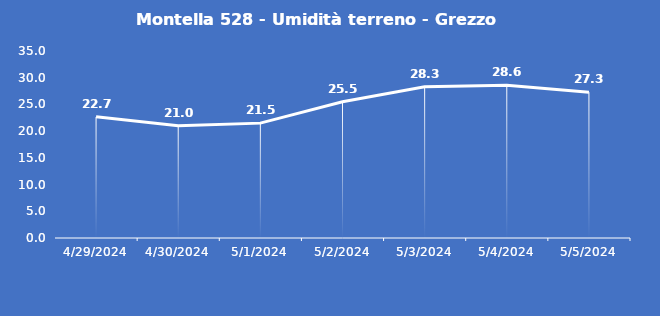
| Category | Montella 528 - Umidità terreno - Grezzo (%VWC) |
|---|---|
| 4/29/24 | 22.7 |
| 4/30/24 | 21 |
| 5/1/24 | 21.5 |
| 5/2/24 | 25.5 |
| 5/3/24 | 28.3 |
| 5/4/24 | 28.6 |
| 5/5/24 | 27.3 |